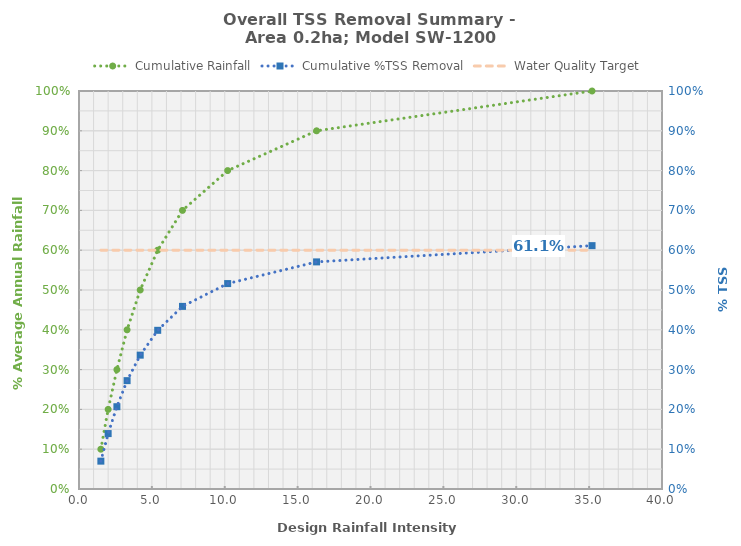
| Category | Cumulative Rainfall |
|---|---|
| 1.5 | 0.1 |
| 2.0 | 0.2 |
| 2.6 | 0.3 |
| 3.3 | 0.4 |
| 4.2 | 0.5 |
| 5.4 | 0.6 |
| 7.1 | 0.7 |
| 10.2 | 0.8 |
| 16.3 | 0.9 |
| 35.2 | 1 |